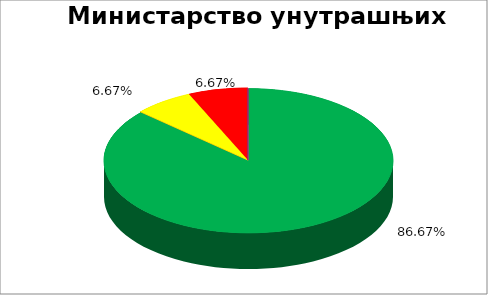
| Category | Министарство унутрашњих послова  |
|---|---|
| 0 | 0.867 |
| 1 | 0 |
| 2 | 0.067 |
| 3 | 0.067 |
| 4 | 0 |